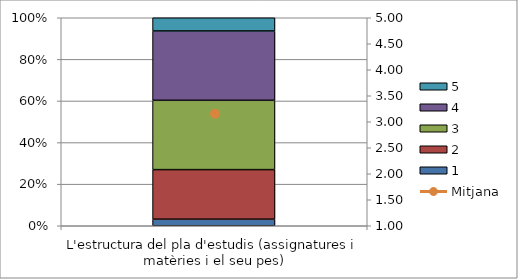
| Category | 1 | 2 | 3 | 4 | 5 |
|---|---|---|---|---|---|
| L'estructura del pla d'estudis (assignatures i matèries i el seu pes) | 2 | 15 | 21 | 21 | 4 |